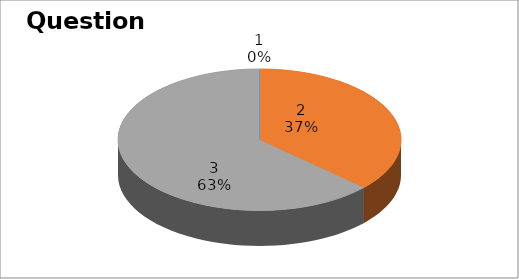
| Category | Series 0 |
|---|---|
| 0 | 0 |
| 1 | 7 |
| 2 | 12 |